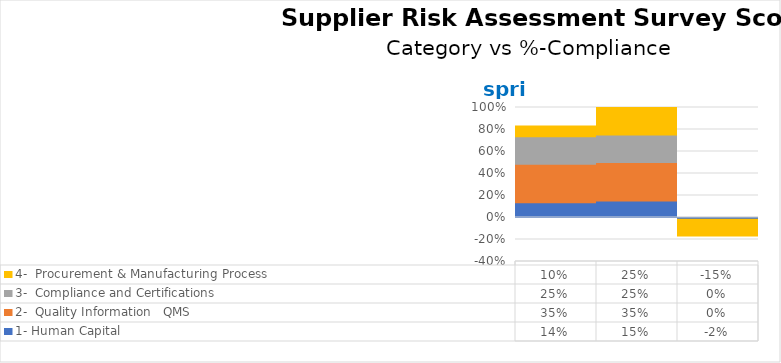
| Category | 1- Human Capital                                                          | 2-  Quality Information   QMS                                                             | 3-  Compliance and Certifications                                                      | 4-  Procurement & Manufacturing Process                                            |
|---|---|---|---|---|
|  | 0.135 | 0.35 | 0.25 | 0.098 |
|  | 0.15 | 0.35 | 0.25 | 0.25 |
|  | -0.015 | 0 | 0 | -0.152 |